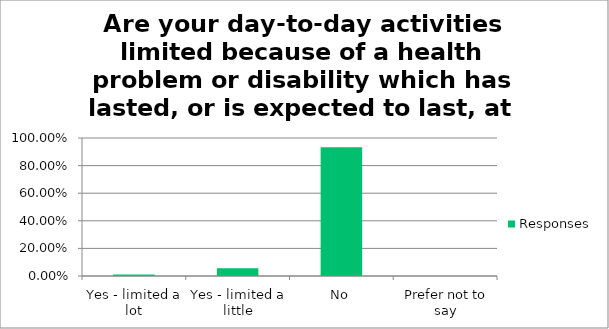
| Category | Responses |
|---|---|
| Yes - limited a lot | 0.011 |
| Yes - limited a little | 0.056 |
| No | 0.933 |
| Prefer not to say | 0 |